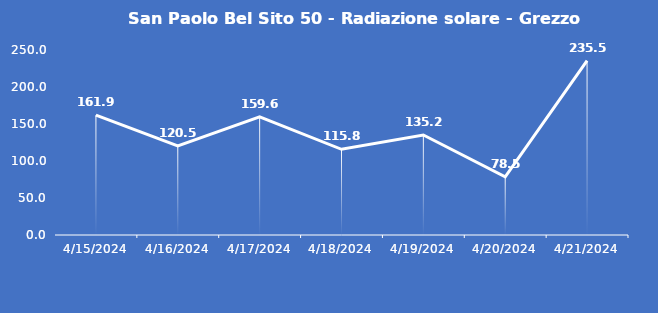
| Category | San Paolo Bel Sito 50 - Radiazione solare - Grezzo (W/m2) |
|---|---|
| 4/15/24 | 161.9 |
| 4/16/24 | 120.5 |
| 4/17/24 | 159.6 |
| 4/18/24 | 115.8 |
| 4/19/24 | 135.2 |
| 4/20/24 | 78.5 |
| 4/21/24 | 235.5 |